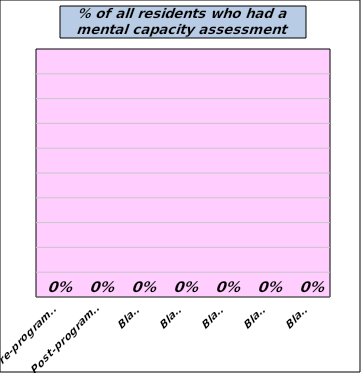
| Category | Had |
|---|---|
| Pre-programme | 0 |
| Post-programme | 0 |
| Blank | 0 |
| Blank | 0 |
| Blank | 0 |
| Blank | 0 |
| Blank | 0 |